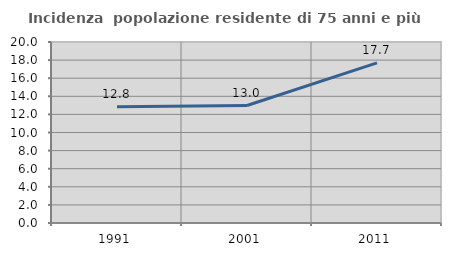
| Category | Incidenza  popolazione residente di 75 anni e più |
|---|---|
| 1991.0 | 12.837 |
| 2001.0 | 12.979 |
| 2011.0 | 17.7 |